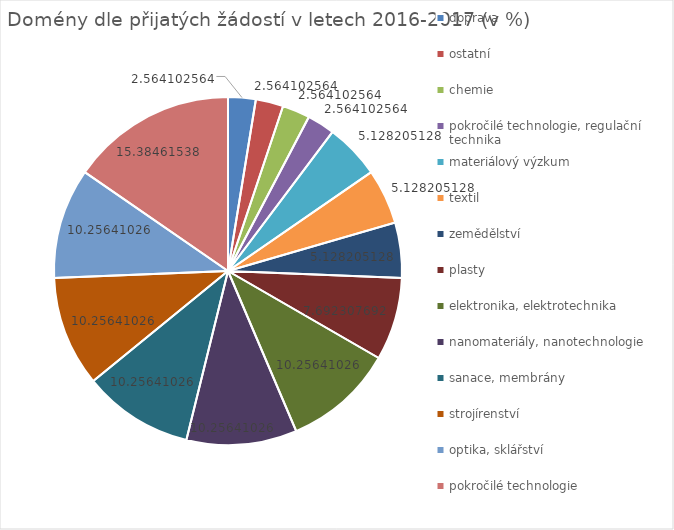
| Category | Series 0 |
|---|---|
| doprava | 2.564 |
| ostatní | 2.564 |
| chemie | 2.564 |
| pokročilé technologie, regulační technika | 2.564 |
| materiálový výzkum | 5.128 |
| textil | 5.128 |
| zemědělství | 5.128 |
| plasty | 7.692 |
| elektronika, elektrotechnika | 10.256 |
| nanomateriály, nanotechnologie | 10.256 |
| sanace, membrány | 10.256 |
| strojírenství | 10.256 |
| optika, sklářství | 10.256 |
| pokročilé technologie | 15.385 |